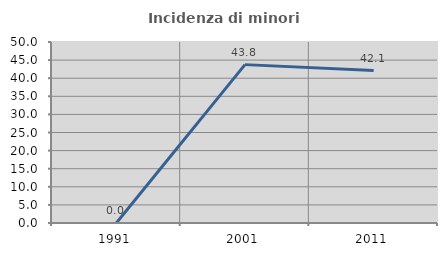
| Category | Incidenza di minori stranieri |
|---|---|
| 1991.0 | 0 |
| 2001.0 | 43.75 |
| 2011.0 | 42.105 |